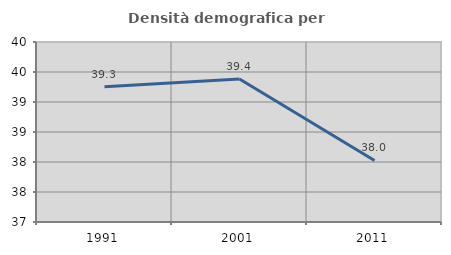
| Category | Densità demografica |
|---|---|
| 1991.0 | 39.254 |
| 2001.0 | 39.383 |
| 2011.0 | 38.025 |